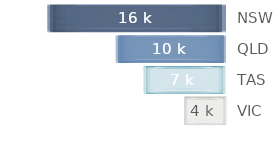
| Category | Series 0 |
|---|---|
| NSW | 15.795 |
| QLD | 9.72 |
| TAS | 7.29 |
| VIC | 3.645 |